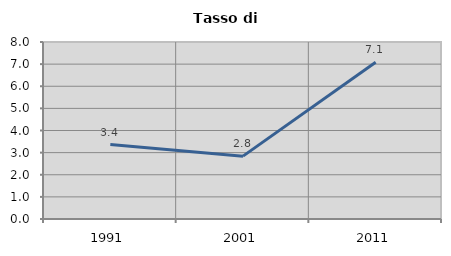
| Category | Tasso di disoccupazione   |
|---|---|
| 1991.0 | 3.366 |
| 2001.0 | 2.842 |
| 2011.0 | 7.085 |